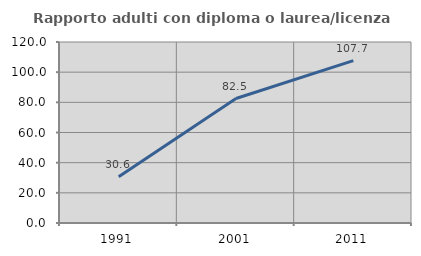
| Category | Rapporto adulti con diploma o laurea/licenza media  |
|---|---|
| 1991.0 | 30.619 |
| 2001.0 | 82.515 |
| 2011.0 | 107.668 |